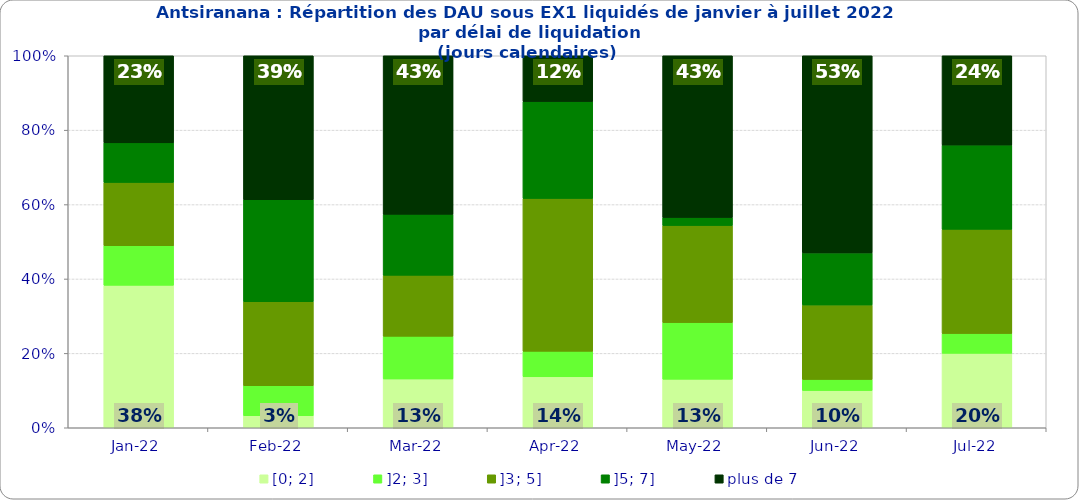
| Category | [0; 2] | ]2; 3] | ]3; 5] | ]5; 7] | plus de 7 |
|---|---|---|---|---|---|
| 2022-01-01 | 0.383 | 0.106 | 0.17 | 0.106 | 0.234 |
| 2022-02-01 | 0.032 | 0.081 | 0.226 | 0.274 | 0.387 |
| 2022-03-01 | 0.131 | 0.115 | 0.164 | 0.164 | 0.426 |
| 2022-04-01 | 0.137 | 0.068 | 0.411 | 0.26 | 0.123 |
| 2022-05-01 | 0.13 | 0.152 | 0.261 | 0.022 | 0.435 |
| 2022-06-01 | 0.1 | 0.03 | 0.2 | 0.14 | 0.53 |
| 2022-07-01 | 0.2 | 0.053 | 0.28 | 0.227 | 0.24 |